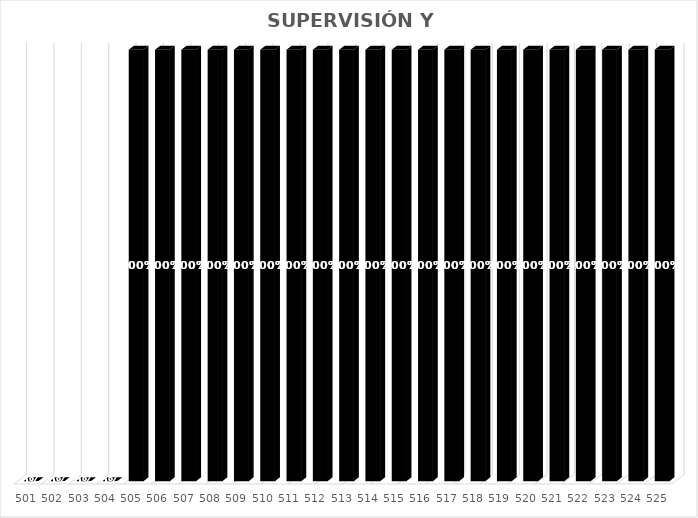
| Category | % Avance |
|---|---|
| 501.0 | 0 |
| 502.0 | 0 |
| 503.0 | 0 |
| 504.0 | 0 |
| 505.0 | 1 |
| 506.0 | 1 |
| 507.0 | 1 |
| 508.0 | 1 |
| 509.0 | 1 |
| 510.0 | 1 |
| 511.0 | 1 |
| 512.0 | 1 |
| 513.0 | 1 |
| 514.0 | 1 |
| 515.0 | 1 |
| 516.0 | 1 |
| 517.0 | 1 |
| 518.0 | 1 |
| 519.0 | 1 |
| 520.0 | 1 |
| 521.0 | 1 |
| 522.0 | 1 |
| 523.0 | 1 |
| 524.0 | 1 |
| 525.0 | 1 |